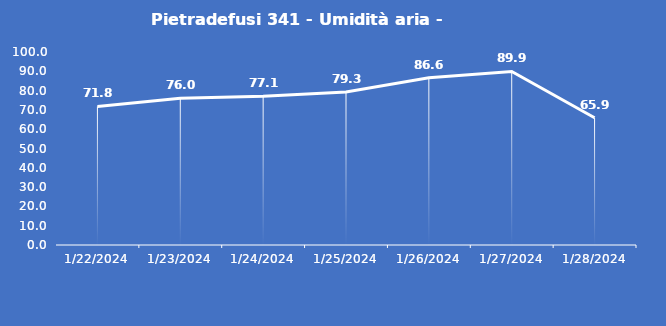
| Category | Pietradefusi 341 - Umidità aria - Grezzo (%) |
|---|---|
| 1/22/24 | 71.8 |
| 1/23/24 | 76 |
| 1/24/24 | 77.1 |
| 1/25/24 | 79.3 |
| 1/26/24 | 86.6 |
| 1/27/24 | 89.9 |
| 1/28/24 | 65.9 |